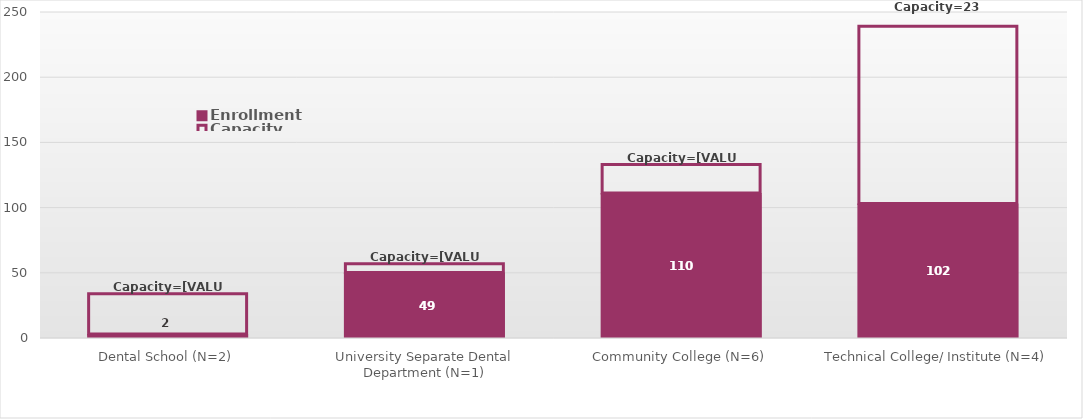
| Category | Enrollment | Capacity  | CapacitySum |
|---|---|---|---|
| Dental School (N=2) | 2 | 32 | 32 |
| University Separate Dental Department (N=1) | 49 | 8 | 60 |
| Community College (N=6) | 110 | 23 | 116 |
| Technical College/ Institute (N=4) | 102 | 137 | 239 |